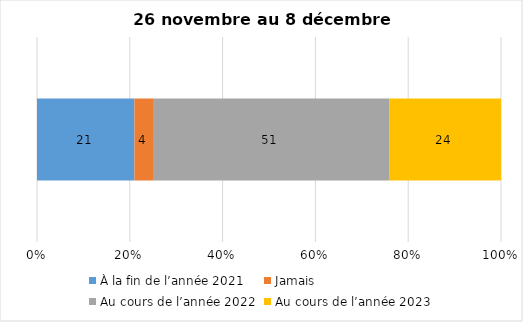
| Category | À la fin de l’année 2021 | Jamais | Au cours de l’année 2022 | Au cours de l’année 2023 |
|---|---|---|---|---|
| 0 | 21 | 4 | 51 | 24 |